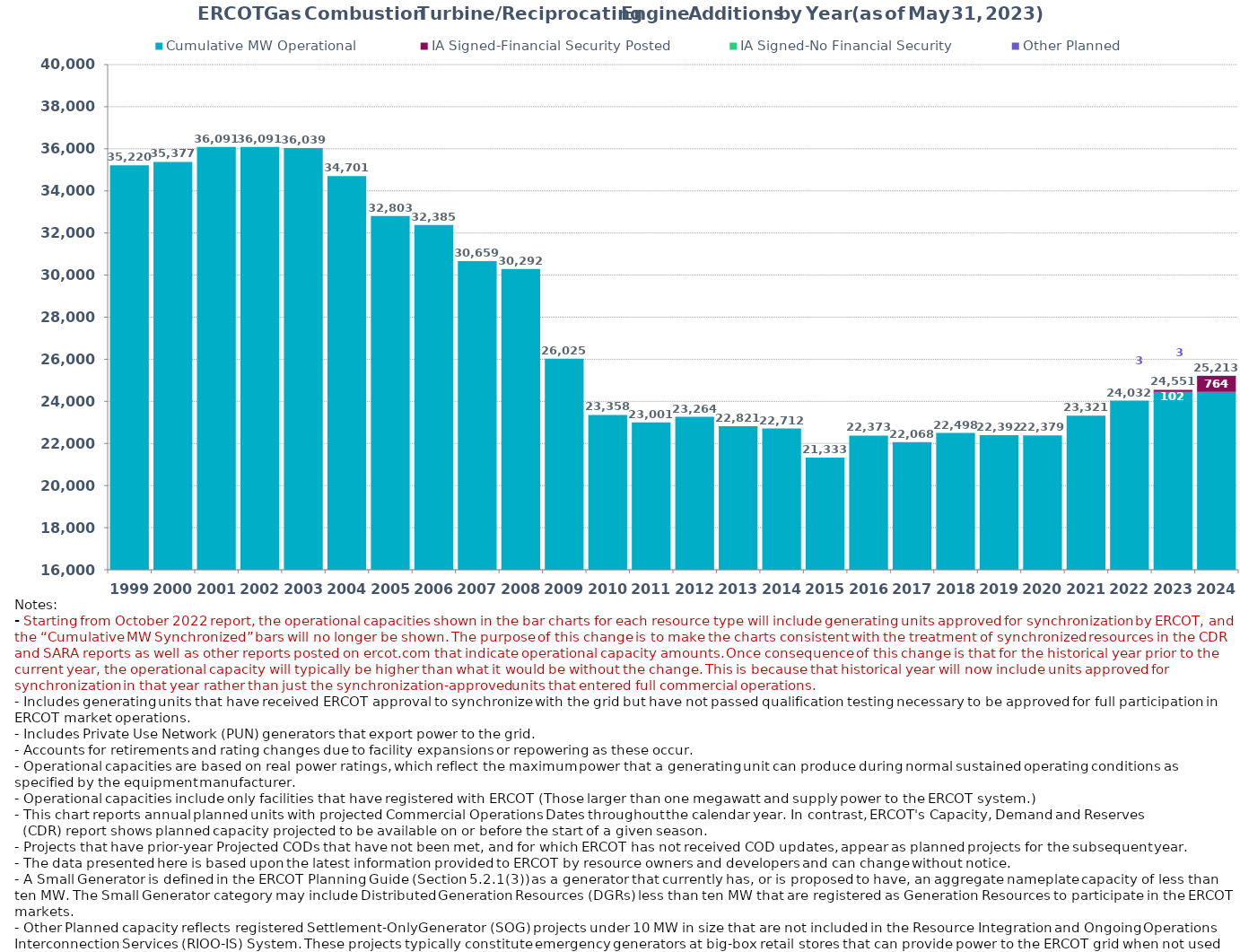
| Category | Cumulative MW Operational  | IA Signed-Financial Security Posted  | IA Signed-No Financial Security  | Other Planned | Cumulative Installed and Planned |
|---|---|---|---|---|---|
| 1999.0 | 35219.87 | 0 | 0 | 0 | 35219.87 |
| 2000.0 | 35377.48 | 0 | 0 | 0 | 35377.48 |
| 2001.0 | 36091.14 | 0 | 0 | 0 | 36091.14 |
| 2002.0 | 36091.14 | 0 | 0 | 0 | 36091.14 |
| 2003.0 | 36039.14 | 0 | 0 | 0 | 36039.14 |
| 2004.0 | 34701.24 | 0 | 0 | 0 | 34701.24 |
| 2005.0 | 32803.04 | 0 | 0 | 0 | 32803.04 |
| 2006.0 | 32385.14 | 0 | 0 | 0 | 32385.14 |
| 2007.0 | 30659.14 | 0 | 0 | 0 | 30659.14 |
| 2008.0 | 30291.94 | 0 | 0 | 0 | 30291.94 |
| 2009.0 | 26025.17 | 0 | 0 | 0 | 26025.17 |
| 2010.0 | 23358.05 | 0 | 0 | 0 | 23358.05 |
| 2011.0 | 23001.35 | 0 | 0 | 0 | 23001.35 |
| 2012.0 | 23263.55 | 0 | 0 | 0 | 23263.55 |
| 2013.0 | 22820.71 | 0 | 0 | 0 | 22820.71 |
| 2014.0 | 22711.71 | 0 | 0 | 0 | 22711.71 |
| 2015.0 | 21332.91 | 0 | 0 | 0 | 21332.91 |
| 2016.0 | 22373.29 | 0 | 0 | 0 | 22373.29 |
| 2017.0 | 22068.43 | 0 | 0 | 0 | 22068.43 |
| 2018.0 | 22497.59 | 0 | 0 | 0 | 22497.59 |
| 2019.0 | 22392.29 | 0 | 0 | 0 | 22392.29 |
| 2020.0 | 22379.29 | 0 | 0 | 0 | 22379.29 |
| 2021.0 | 23321.49 | 0 | 0 | 0 | 23321.49 |
| 2022.0 | 24031.64 | 0 | 0 | 0 | 24031.64 |
| 2023.0 | 24446.29 | 102 | 0 | 3.2 | 24551.49 |
| 2024.0 | 24446.29 | 764 | 0 | 3.2 | 25213.49 |